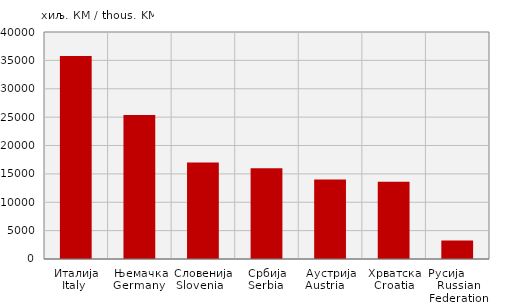
| Category | Извоз
Export |
|---|---|
| Италија
Italy  | 35783 |
| Њемачка
Germany  | 25396 |
| Словенија
Slovenia   | 17006 |
| Србија
Serbia  | 15986 |
| Аустрија
Austria     | 14024 |
| Хрватска
Croatia | 13630 |
| Русија        Russian Federation | 3266 |